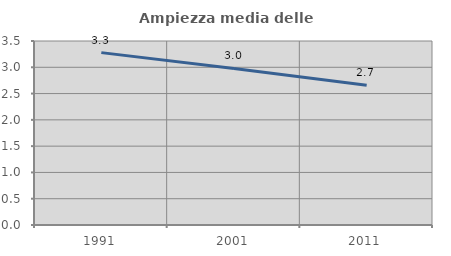
| Category | Ampiezza media delle famiglie |
|---|---|
| 1991.0 | 3.279 |
| 2001.0 | 2.978 |
| 2011.0 | 2.657 |